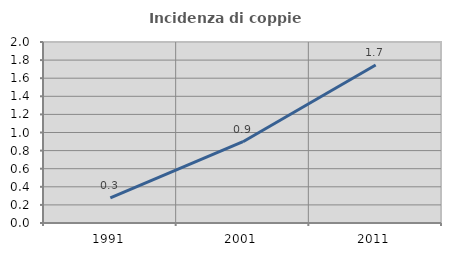
| Category | Incidenza di coppie miste |
|---|---|
| 1991.0 | 0.277 |
| 2001.0 | 0.898 |
| 2011.0 | 1.745 |